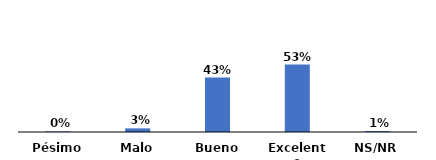
| Category | Series 0 |
|---|---|
| Pésimo | 0.005 |
| Malo | 0.029 |
| Bueno | 0.429 |
| Excelente | 0.531 |
| NS/NR | 0.008 |